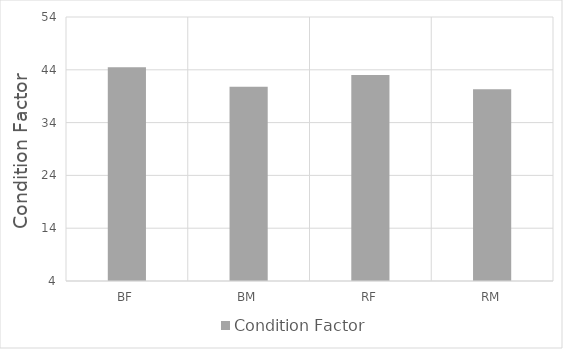
| Category | Condition Factor |
|---|---|
| BF | 44.5 |
| BM | 40.8 |
| RF | 43 |
| RM | 40.3 |